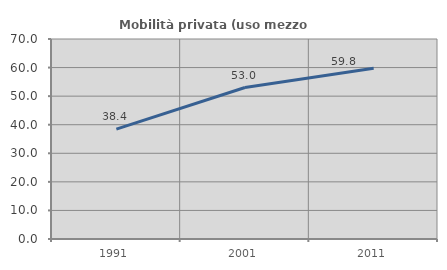
| Category | Mobilità privata (uso mezzo privato) |
|---|---|
| 1991.0 | 38.439 |
| 2001.0 | 53.011 |
| 2011.0 | 59.753 |